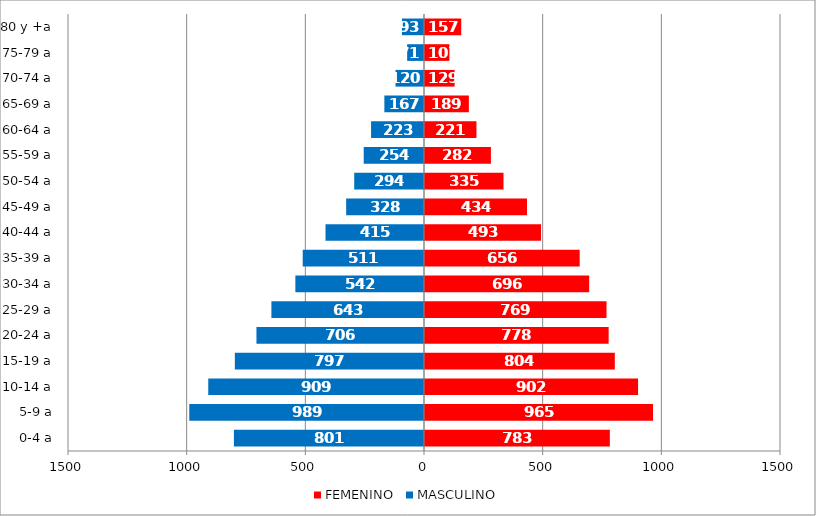
| Category | FEMENINO | MASCULINO |
|---|---|---|
| 0-4 a | 783 | -801 |
| 5-9 a | 965 | -989 |
| 10-14 a | 902 | -909 |
| 15-19 a | 804 | -797 |
| 20-24 a | 778 | -706 |
| 25-29 a | 769 | -643 |
| 30-34 a | 696 | -542 |
| 35-39 a | 656 | -511 |
| 40-44 a | 493 | -415 |
| 45-49 a | 434 | -328 |
| 50-54 a | 335 | -294 |
| 55-59 a | 282 | -254 |
| 60-64 a | 221 | -223 |
| 65-69 a | 189 | -167 |
| 70-74 a | 129 | -120 |
| 75-79 a | 107 | -71 |
| 80 y +a | 157 | -93 |